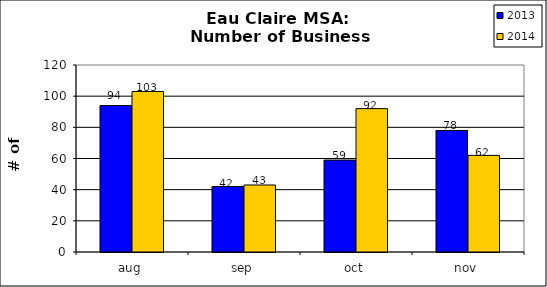
| Category | 2013 | 2014 |
|---|---|---|
| aug | 94 | 103 |
| sep | 42 | 43 |
| oct | 59 | 92 |
| nov | 78 | 62 |